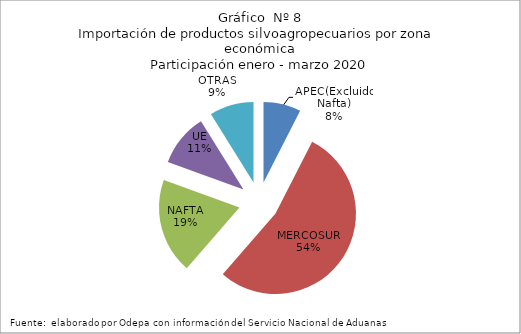
| Category | Series 0 |
|---|---|
| APEC(Excluido Nafta) | 76250.55 |
| MERCOSUR | 545719.483 |
| NAFTA | 194250.123 |
| UE | 107591.088 |
| OTRAS | 89754.757 |